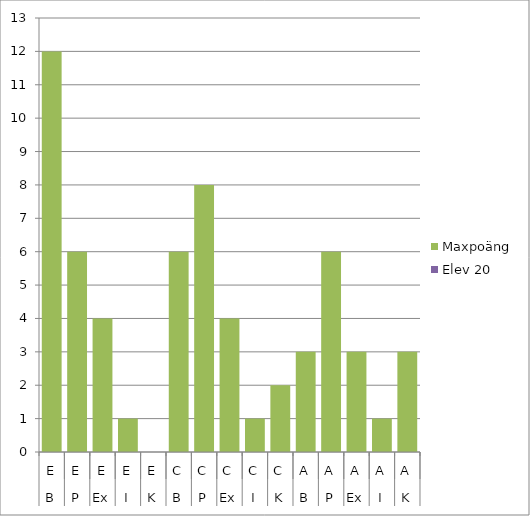
| Category | Maxpoäng | Elev 20 |
|---|---|---|
| 0 | 12 | 0 |
| 1 | 6 | 0 |
| 2 | 4 | 0 |
| 3 | 1 | 0 |
| 4 | 0 | 0 |
| 5 | 6 | 0 |
| 6 | 8 | 0 |
| 7 | 4 | 0 |
| 8 | 1 | 0 |
| 9 | 2 | 0 |
| 10 | 3 | 0 |
| 11 | 6 | 0 |
| 12 | 3 | 0 |
| 13 | 1 | 0 |
| 14 | 3 | 0 |